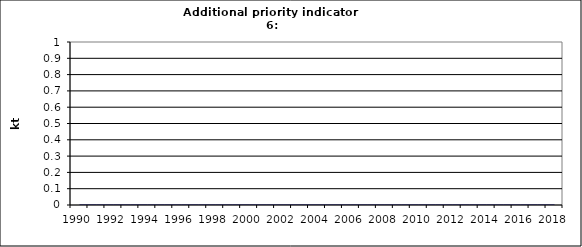
| Category | Cement production, kt |
|---|---|
| 1990 | 0 |
| 1991 | 0 |
| 1992 | 0 |
| 1993 | 0 |
| 1994 | 0 |
| 1995 | 0 |
| 1996 | 0 |
| 1997 | 0 |
| 1998 | 0 |
| 1999 | 0 |
| 2000 | 0 |
| 2001 | 0 |
| 2002 | 0 |
| 2003 | 0 |
| 2004 | 0 |
| 2005 | 0 |
| 2006 | 0 |
| 2007 | 0 |
| 2008 | 0 |
| 2009 | 0 |
| 2010 | 0 |
| 2011 | 0 |
| 2012 | 0 |
| 2013 | 0 |
| 2014 | 0 |
| 2015 | 0 |
| 2016 | 0 |
| 2017 | 0 |
| 2018 | 0 |